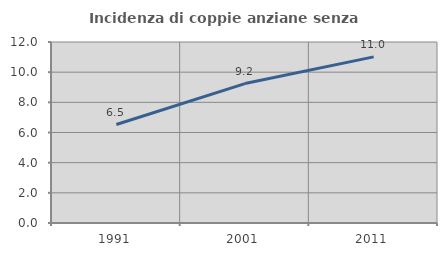
| Category | Incidenza di coppie anziane senza figli  |
|---|---|
| 1991.0 | 6.528 |
| 2001.0 | 9.243 |
| 2011.0 | 11.012 |